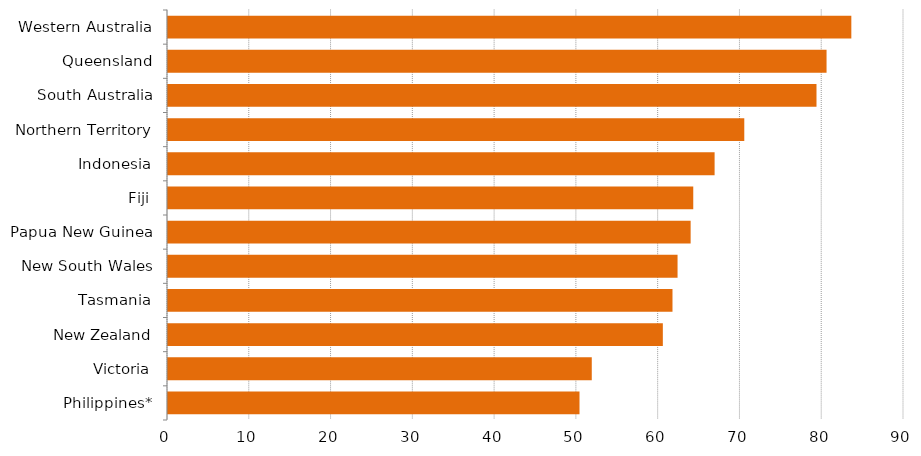
| Category | Series 0 |
|---|---|
| Philippines* | 50.32 |
| Victoria | 51.82 |
| New Zealand | 60.51 |
| Tasmania | 61.69 |
| New South Wales | 62.31 |
| Papua New Guinea | 63.91 |
| Fiji | 64.23 |
| Indonesia | 66.84 |
| Northern Territory | 70.47 |
| South Australia | 79.3 |
| Queensland | 80.53 |
| Western Australia | 83.56 |